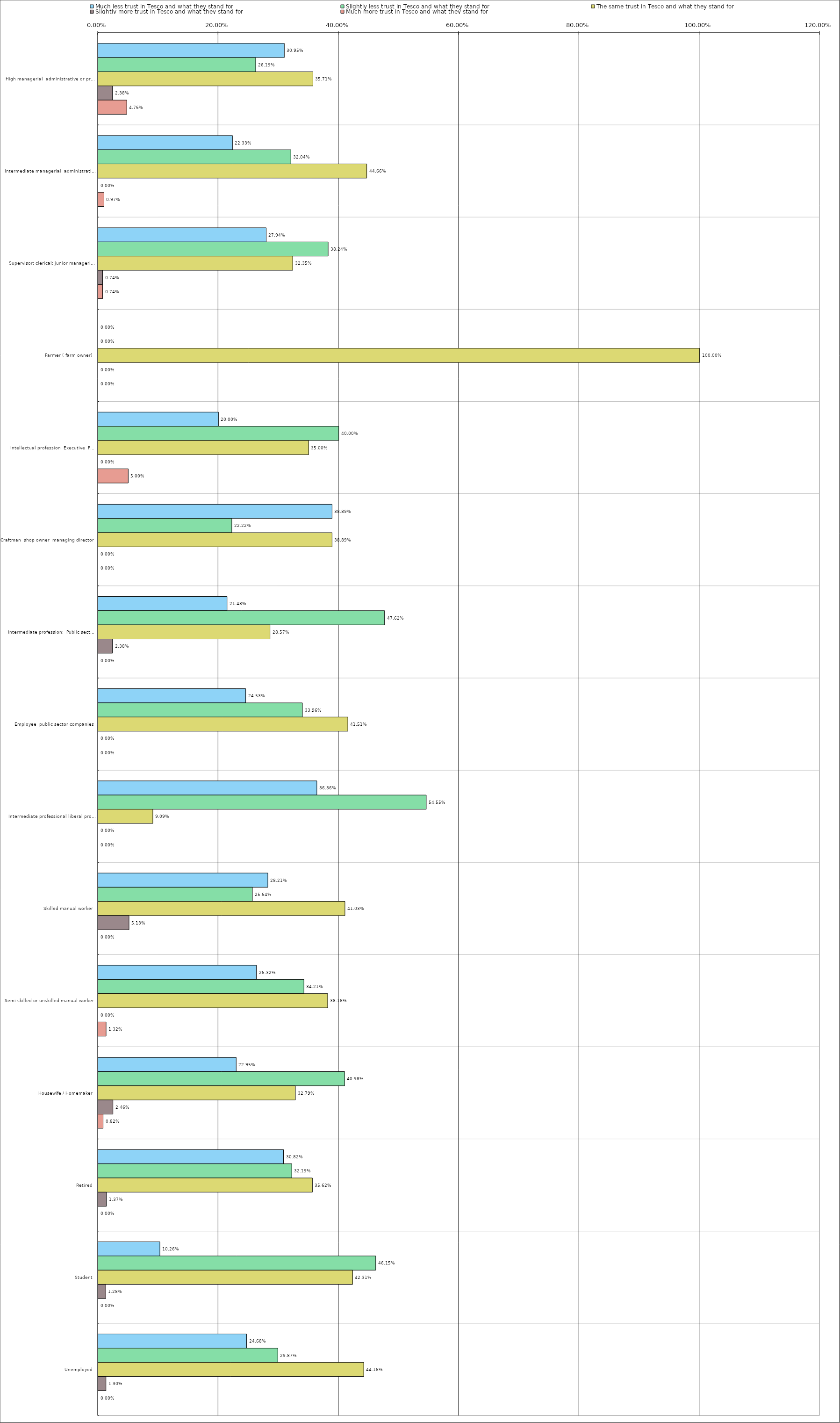
| Category | Much less trust in Tesco and what they stand for | Slightly less trust in Tesco and what they stand for | The same trust in Tesco and what they stand for | Slightly more trust in Tesco and what they stand for | Much more trust in Tesco and what they stand for |
|---|---|---|---|---|---|
| 0 | 0.31 | 0.262 | 0.357 | 0.024 | 0.048 |
| 1 | 0.223 | 0.32 | 0.447 | 0 | 0.01 |
| 2 | 0.279 | 0.382 | 0.324 | 0.007 | 0.007 |
| 3 | 0 | 0 | 1 | 0 | 0 |
| 4 | 0.2 | 0.4 | 0.35 | 0 | 0.05 |
| 5 | 0.389 | 0.222 | 0.389 | 0 | 0 |
| 6 | 0.214 | 0.476 | 0.286 | 0.024 | 0 |
| 7 | 0.245 | 0.34 | 0.415 | 0 | 0 |
| 8 | 0.364 | 0.546 | 0.091 | 0 | 0 |
| 9 | 0.282 | 0.256 | 0.41 | 0.051 | 0 |
| 10 | 0.263 | 0.342 | 0.382 | 0 | 0.013 |
| 11 | 0.23 | 0.41 | 0.328 | 0.025 | 0.008 |
| 12 | 0.308 | 0.322 | 0.356 | 0.014 | 0 |
| 13 | 0.103 | 0.462 | 0.423 | 0.013 | 0 |
| 14 | 0.247 | 0.299 | 0.442 | 0.013 | 0 |